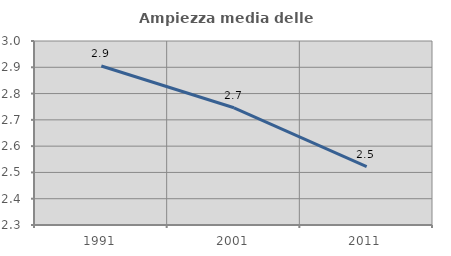
| Category | Ampiezza media delle famiglie |
|---|---|
| 1991.0 | 2.905 |
| 2001.0 | 2.746 |
| 2011.0 | 2.522 |